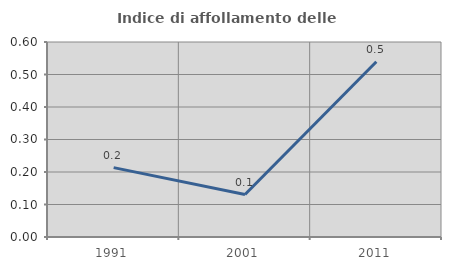
| Category | Indice di affollamento delle abitazioni  |
|---|---|
| 1991.0 | 0.213 |
| 2001.0 | 0.131 |
| 2011.0 | 0.539 |